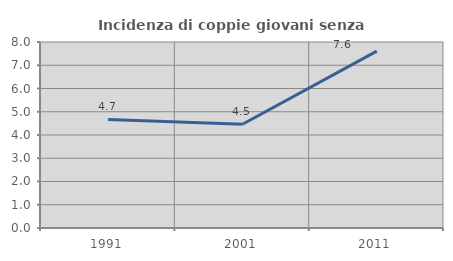
| Category | Incidenza di coppie giovani senza figli |
|---|---|
| 1991.0 | 4.671 |
| 2001.0 | 4.462 |
| 2011.0 | 7.609 |